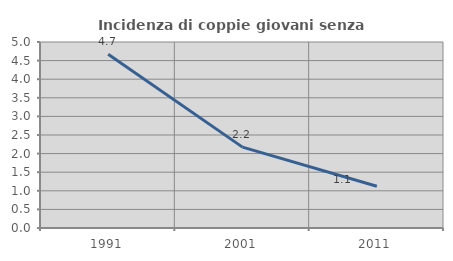
| Category | Incidenza di coppie giovani senza figli |
|---|---|
| 1991.0 | 4.673 |
| 2001.0 | 2.174 |
| 2011.0 | 1.124 |